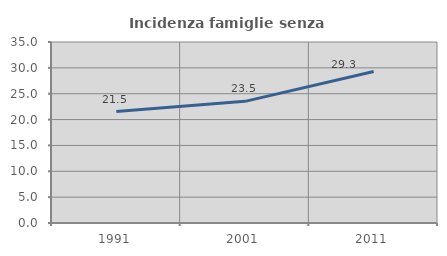
| Category | Incidenza famiglie senza nuclei |
|---|---|
| 1991.0 | 21.548 |
| 2001.0 | 23.522 |
| 2011.0 | 29.286 |